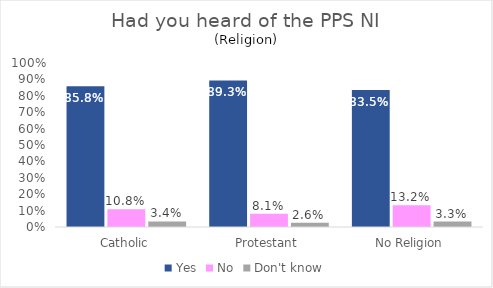
| Category | Yes | No | Don't know |
|---|---|---|---|
| Catholic | 0.858 | 0.108 | 0.034 |
| Protestant | 0.893 | 0.081 | 0.026 |
| No Religion | 0.835 | 0.132 | 0.033 |